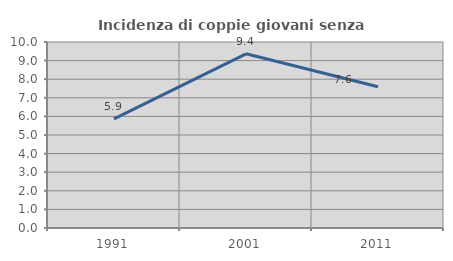
| Category | Incidenza di coppie giovani senza figli |
|---|---|
| 1991.0 | 5.868 |
| 2001.0 | 9.366 |
| 2011.0 | 7.598 |